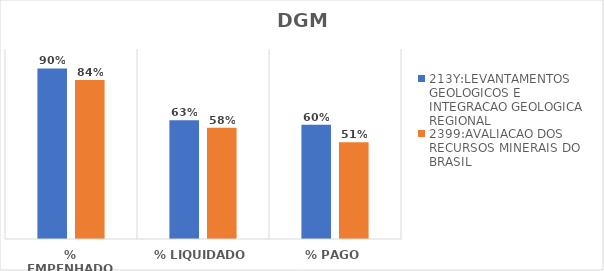
| Category | 213Y:LEVANTAMENTOS GEOLOGICOS E INTEGRACAO GEOLOGICA REGIONAL | 2399:AVALIACAO DOS RECURSOS MINERAIS DO BRASIL |
|---|---|---|
| % EMPENHADO | 0.898 | 0.836 |
| % LIQUIDADO | 0.626 | 0.585 |
| % PAGO | 0.602 | 0.509 |